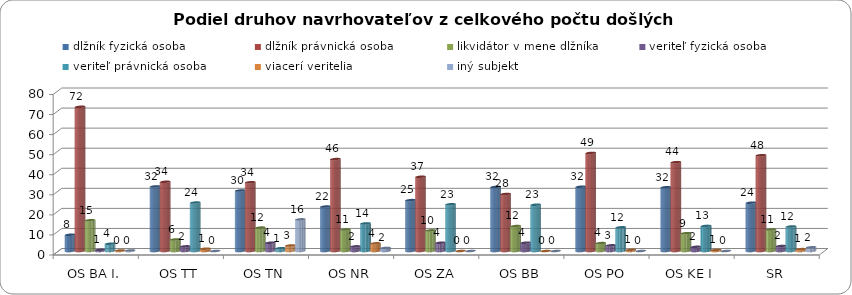
| Category | dlžník fyzická osoba | dlžník právnická osoba | likvidátor v mene dlžníka | veriteľ fyzická osoba | veriteľ právnická osoba | viacerí veritelia | iný subjekt  |
|---|---|---|---|---|---|---|---|
| OS BA I. | 8.078 | 71.866 | 15.32 | 0.557 | 3.621 | 0.279 | 0.279 |
| OS TT | 32.184 | 34.483 | 5.747 | 2.299 | 24.138 | 1.149 | 0 |
| OS TN | 30.137 | 34.247 | 11.644 | 4.11 | 1.37 | 2.74 | 15.753 |
| OS NR | 22.137 | 45.802 | 10.687 | 2.29 | 13.74 | 3.817 | 1.527 |
| OS ZA | 25.342 | 36.986 | 10.274 | 4.11 | 23.288 | 0 | 0 |
| OS BB | 31.953 | 28.402 | 12.426 | 4.142 | 23.077 | 0 | 0 |
| OS PO | 32.022 | 48.876 | 3.933 | 2.809 | 11.798 | 0.562 | 0 |
| OS KE I | 31.771 | 44.271 | 8.854 | 2.083 | 12.5 | 0.521 | 0 |
| SR | 24.077 | 47.727 | 10.724 | 2.486 | 12.216 | 0.923 | 1.847 |